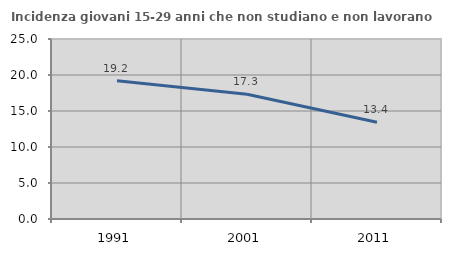
| Category | Incidenza giovani 15-29 anni che non studiano e non lavorano  |
|---|---|
| 1991.0 | 19.186 |
| 2001.0 | 17.333 |
| 2011.0 | 13.433 |